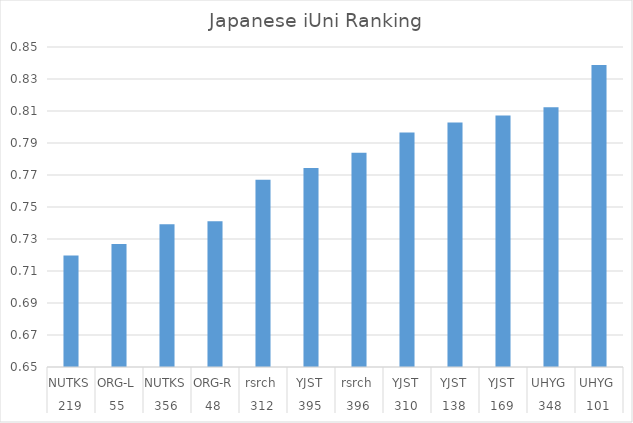
| Category | Series 0 |
|---|---|
| 0 | 0.72 |
| 1 | 0.727 |
| 2 | 0.739 |
| 3 | 0.741 |
| 4 | 0.767 |
| 5 | 0.774 |
| 6 | 0.784 |
| 7 | 0.797 |
| 8 | 0.803 |
| 9 | 0.807 |
| 10 | 0.812 |
| 11 | 0.839 |